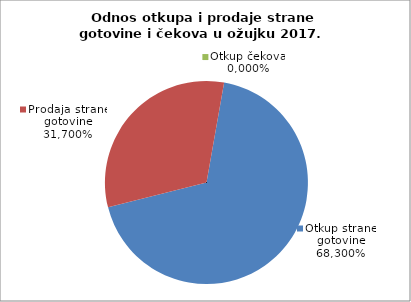
| Category | Otkup strane gotovine |
|---|---|
| 0 | 0.683 |
| 1 | 0.317 |
| 2 | 0 |